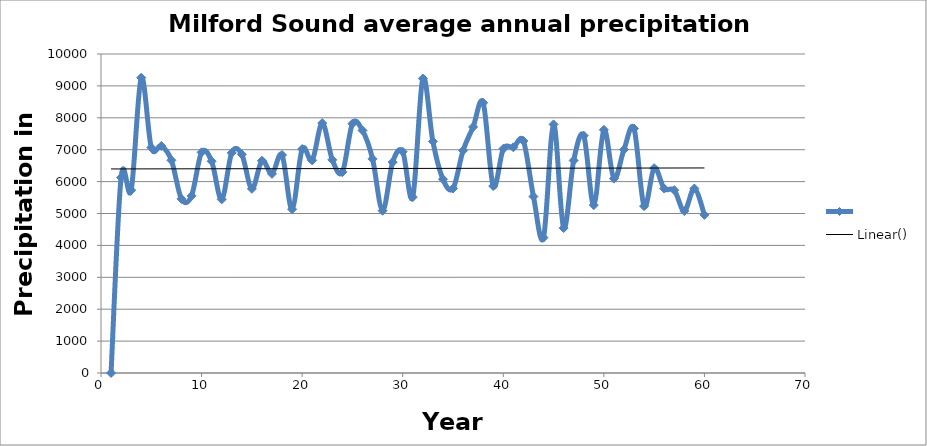
| Category | Series 0 |
|---|---|
| 0 | 0 |
| 1 | 6125.8 |
| 2 | 5731.4 |
| 3 | 9258.8 |
| 4 | 7068.4 |
| 5 | 7116.3 |
| 6 | 6669.1 |
| 7 | 5457.9 |
| 8 | 5552.9 |
| 9 | 6917.9 |
| 10 | 6638 |
| 11 | 5442.9 |
| 12 | 6902.2 |
| 13 | 6853.4 |
| 14 | 5774.3 |
| 15 | 6654.5 |
| 16 | 6242.8 |
| 17 | 6834 |
| 18 | 5134.3 |
| 19 | 7019 |
| 20 | 6665 |
| 21 | 7835.2 |
| 22 | 6682.4 |
| 23 | 6295.2 |
| 24 | 7816 |
| 25 | 7602.7 |
| 26 | 6714.2 |
| 27 | 5086.7 |
| 28 | 6609.1 |
| 29 | 6936.8 |
| 30 | 5515.2 |
| 31 | 9232.3 |
| 32 | 7260.2 |
| 33 | 6075.7 |
| 34 | 5783.5 |
| 35 | 6972 |
| 36 | 7711.7 |
| 37 | 8470.6 |
| 38 | 5860 |
| 39 | 7029 |
| 40 | 7074.3 |
| 41 | 7273.3 |
| 42 | 5532.5 |
| 43 | 4242.9 |
| 44 | 7792.2 |
| 45 | 4542.6 |
| 46 | 6663.2 |
| 47 | 7439.3 |
| 48 | 5261.3 |
| 49 | 7623 |
| 50 | 6093.7 |
| 51 | 7003.1 |
| 52 | 7663.8 |
| 53 | 5230.4 |
| 54 | 6421.1 |
| 55 | 5781.3 |
| 56 | 5731.6 |
| 57 | 5076.3 |
| 58 | 5783.9 |
| 59 | 4957.8 |